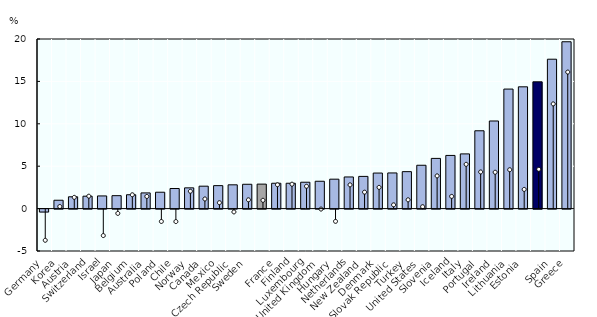
| Category | Maximum gap (country-specific peak ↗) |
|---|---|
| Germany | -0.346 |
| Korea | 0.986 |
| Austria | 1.392 |
| Switzerland | 1.464 |
| Israel | 1.495 |
| Japan | 1.526 |
| Belgium | 1.633 |
| Australia | 1.85 |
| Poland | 1.932 |
| Chile | 2.369 |
| Norway | 2.448 |
| Canada | 2.643 |
| Mexico | 2.708 |
| Czech Republic | 2.804 |
| Sweden | 2.868 |
|  | 2.887 |
| France | 2.988 |
| Finland | 2.99 |
| Luxembourg | 3.109 |
| United Kingdom | 3.225 |
| Hungary | 3.469 |
| Netherlands | 3.732 |
| New Zealand | 3.798 |
| Denmark | 4.191 |
| Slovak Republic | 4.205 |
| Turkey | 4.358 |
| United States | 5.112 |
| Slovenia | 5.919 |
| Iceland | 6.27 |
| Italy | 6.45 |
| Portugal | 9.178 |
| Ireland | 10.331 |
| Lithuania | 14.096 |
| Estonia | 14.36 |
|  | 14.951 |
| Spain | 17.616 |
| Greece | 19.674 |